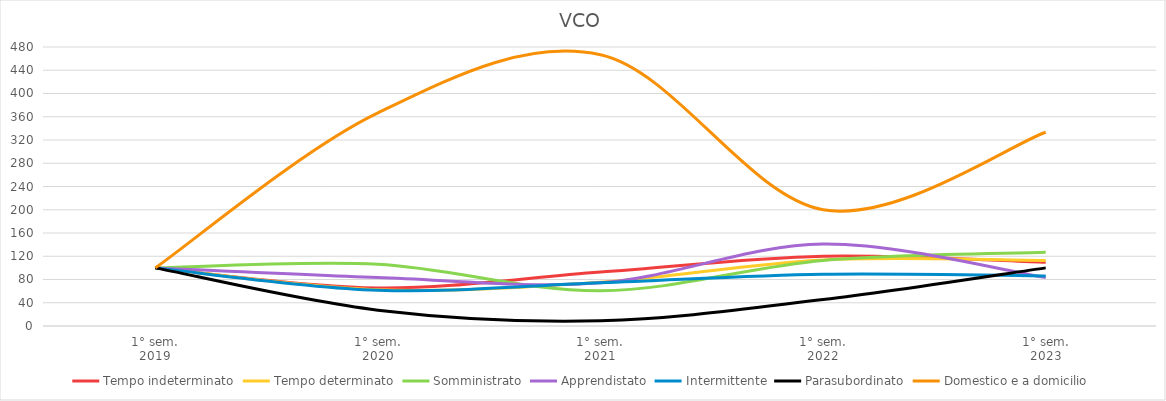
| Category | Tempo indeterminato | Tempo determinato | Somministrato | Apprendistato | Intermittente | Parasubordinato | Domestico e a domicilio |
|---|---|---|---|---|---|---|---|
| 1° sem.
2019 | 100 | 100 | 100 | 100 | 100 | 100 | 100 |
| 1° sem.
2020 | 65.584 | 62.261 | 106.338 | 83.333 | 61.386 | 27.273 | 366.667 |
| 1° sem.
2021 | 92.857 | 75.318 | 60.563 | 74.242 | 74.257 | 9.091 | 466.667 |
| 1° sem.
2022 | 120.13 | 113.694 | 112.676 | 140.909 | 89.109 | 45.455 | 200 |
| 1° sem.
2023 | 109.74 | 112.898 | 126.761 | 83.333 | 86.139 | 100 | 333.333 |